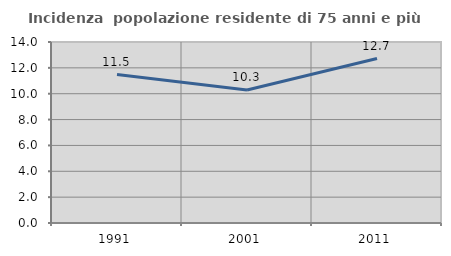
| Category | Incidenza  popolazione residente di 75 anni e più |
|---|---|
| 1991.0 | 11.478 |
| 2001.0 | 10.29 |
| 2011.0 | 12.722 |